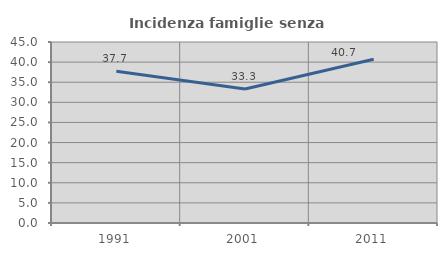
| Category | Incidenza famiglie senza nuclei |
|---|---|
| 1991.0 | 37.726 |
| 2001.0 | 33.333 |
| 2011.0 | 40.698 |